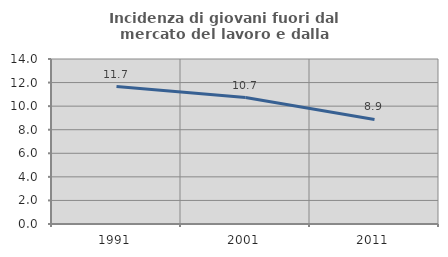
| Category | Incidenza di giovani fuori dal mercato del lavoro e dalla formazione  |
|---|---|
| 1991.0 | 11.667 |
| 2001.0 | 10.726 |
| 2011.0 | 8.871 |